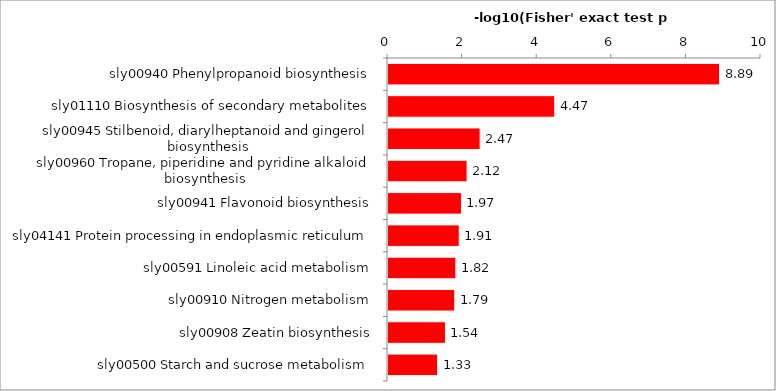
| Category | Series 0 |
|---|---|
| sly00940 Phenylpropanoid biosynthesis | 8.89 |
| sly01110 Biosynthesis of secondary metabolites | 4.47 |
| sly00945 Stilbenoid, diarylheptanoid and gingerol biosynthesis | 2.47 |
| sly00960 Tropane, piperidine and pyridine alkaloid biosynthesis | 2.12 |
| sly00941 Flavonoid biosynthesis | 1.97 |
| sly04141 Protein processing in endoplasmic reticulum | 1.91 |
| sly00591 Linoleic acid metabolism | 1.82 |
| sly00910 Nitrogen metabolism | 1.79 |
| sly00908 Zeatin biosynthesis | 1.54 |
| sly00500 Starch and sucrose metabolism | 1.33 |